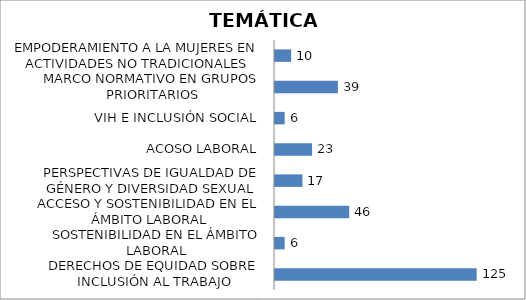
| Category | Series 0 |
|---|---|
| DERECHOS DE EQUIDAD SOBRE INCLUSIÓN AL TRABAJO | 125 |
| SOSTENIBILIDAD EN EL ÁMBITO LABORAL | 6 |
| ACCESO Y SOSTENIBILIDAD EN EL ÁMBITO LABORAL | 46 |
| PERSPECTIVAS DE IGUALDAD DE GÉNERO Y DIVERSIDAD SEXUAL | 17 |
| ACOSO LABORAL | 23 |
| VIH E INCLUSIÓN SOCIAL | 6 |
| MARCO NORMATIVO EN GRUPOS PRIORITARIOS | 39 |
| EMPODERAMIENTO A LA MUJERES EN ACTIVIDADES NO TRADICIONALES | 10 |